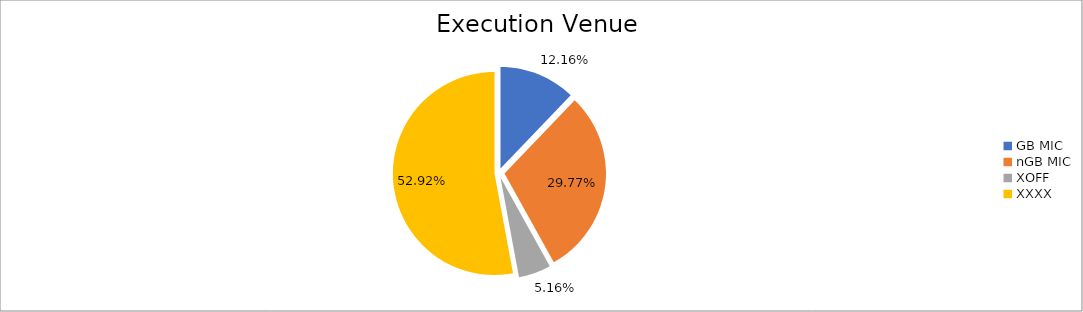
| Category | Series 0 |
|---|---|
| GB MIC | 1079682.638 |
| nGB MIC | 2643773.45 |
| XOFF | 458132.921 |
| XXXX | 4699921.45 |